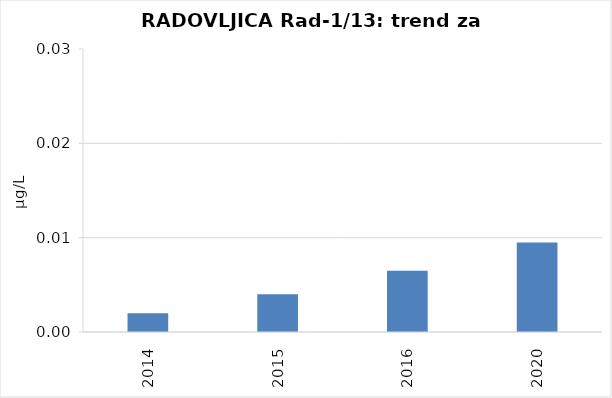
| Category | Vsota |
|---|---|
| 2014 | 0.002 |
| 2015 | 0.004 |
| 2016 | 0.006 |
| 2020 | 0.01 |